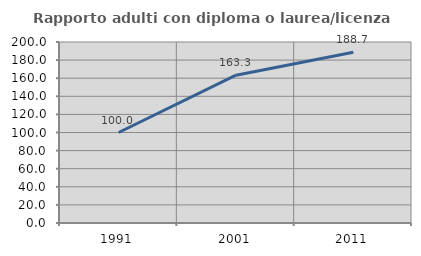
| Category | Rapporto adulti con diploma o laurea/licenza media  |
|---|---|
| 1991.0 | 100 |
| 2001.0 | 163.347 |
| 2011.0 | 188.732 |